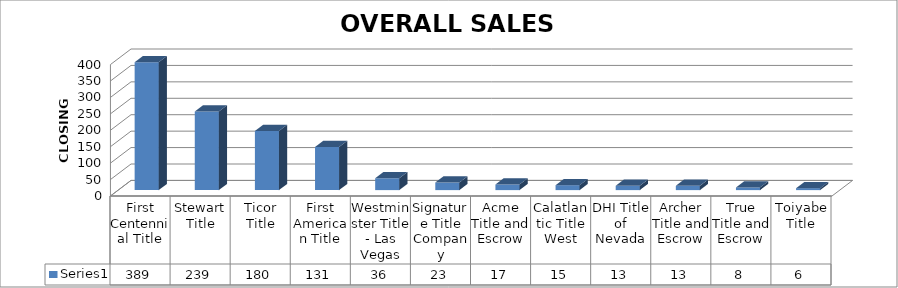
| Category | Series 0 |
|---|---|
| First Centennial Title | 389 |
| Stewart Title | 239 |
| Ticor Title | 180 |
| First American Title | 131 |
| Westminster Title - Las Vegas | 36 |
| Signature Title Company | 23 |
| Acme Title and Escrow | 17 |
| Calatlantic Title West | 15 |
| DHI Title of Nevada | 13 |
| Archer Title and Escrow | 13 |
| True Title and Escrow | 8 |
| Toiyabe Title | 6 |